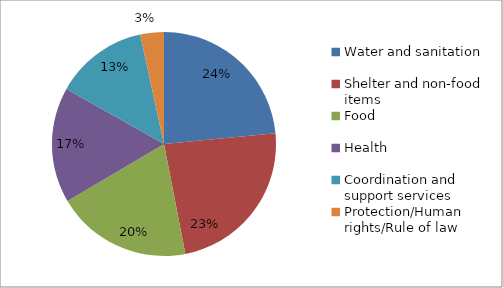
| Category | US$ millions |
|---|---|
| Water and sanitation | 3.501 |
| Shelter and non-food items | 3.5 |
| Food | 2.92 |
| Health | 2.483 |
| Coordination and support services | 2 |
| Protection/Human rights/Rule of law | 0.509 |